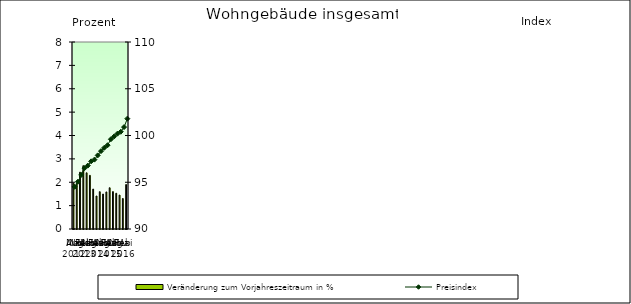
| Category | Veränderung zum Vorjahreszeitraum in % |
|---|---|
| 0 | 1.961 |
| 1 | 1.949 |
| 2 | 2.43 |
| 3 | 2.708 |
| 4 | 2.404 |
| 5 | 2.294 |
| 6 | 1.708 |
| 7 | 1.412 |
| 8 | 1.596 |
| 9 | 1.495 |
| 10 | 1.586 |
| 11 | 1.764 |
| 12 | 1.599 |
| 13 | 1.529 |
| 14 | 1.451 |
| 15 | 1.305 |
| 16 | 1.902 |